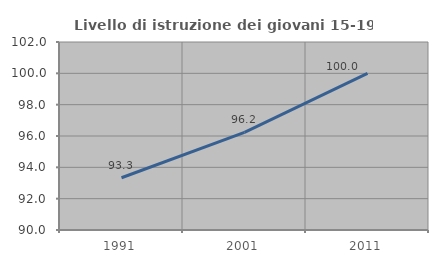
| Category | Livello di istruzione dei giovani 15-19 anni |
|---|---|
| 1991.0 | 93.333 |
| 2001.0 | 96.226 |
| 2011.0 | 100 |